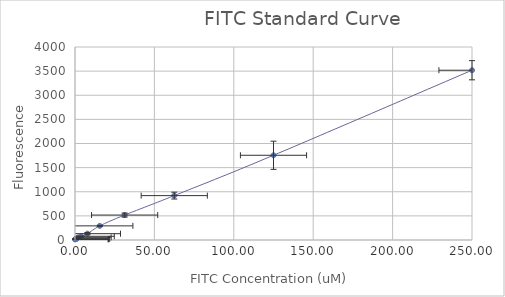
| Category | Series 0 |
|---|---|
| 250.0 | 3518.5 |
| 125.0 | 1756 |
| 62.5 | 920 |
| 31.25 | 517 |
| 15.625 | 292.75 |
| 7.8125 | 131 |
| 3.90625 | 77 |
| 1.953125 | 54.75 |
| 0.9765625 | 24.75 |
| 0.48828125 | 17.75 |
| 0.244140625 | 20.25 |
| 0.0 | 13.25 |